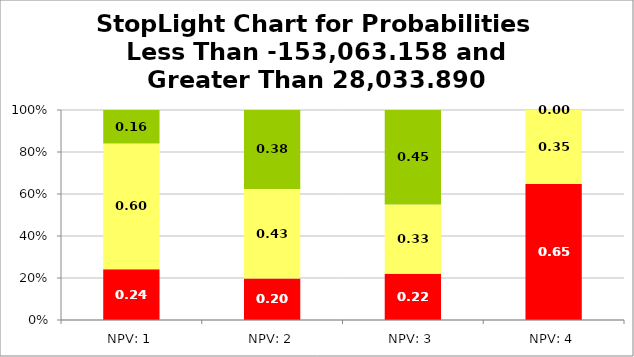
| Category | Series 0 | Series 1 | Series 2 |
|---|---|---|---|
| NPV: 1 | 0.242 | 0.598 | 0.16 |
| NPV: 2 | 0.198 | 0.426 | 0.376 |
| NPV: 3 | 0.22 | 0.33 | 0.45 |
| NPV: 4 | 0.648 | 0.352 | 0 |